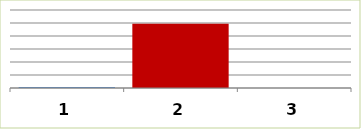
| Category | Series 0 |
|---|---|
| 0 | 40000 |
| 1 | 2475235 |
| 2 | 0 |